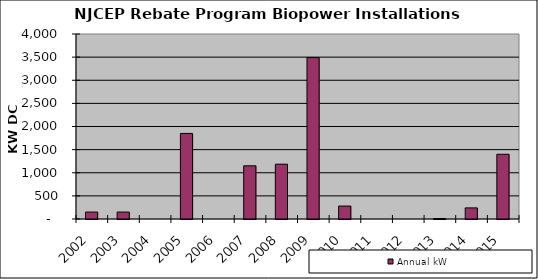
| Category | Annual kW |
|---|---|
| 2002.0 | 150 |
| 2003.0 | 150 |
| 2004.0 | 0 |
| 2005.0 | 1850 |
| 2006.0 | 0 |
| 2007.0 | 1150 |
| 2008.0 | 1185 |
| 2009.0 | 3490 |
| 2010.0 | 280 |
| 2011.0 | 0 |
| 2012.0 | 0 |
| 2013.0 | 10 |
| 2014.0 | 240 |
| 2015.0 | 1400 |